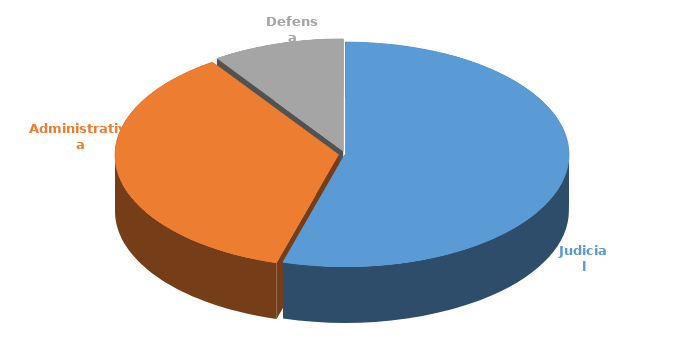
| Category | Cantidad |
|---|---|
| Judicial | 365 |
| Administrativa | 241 |
| Defensa | 64 |